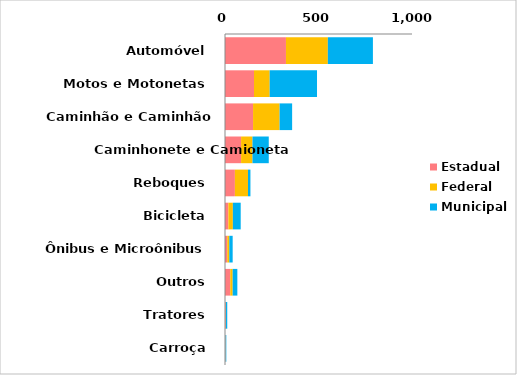
| Category | Estadual | Federal | Municipal |
|---|---|---|---|
| Automóvel | 326 | 224 | 241 |
| Motos e Motonetas | 155 | 84 | 253 |
| Caminhão e Caminhão Trator | 150 | 142 | 67 |
| Caminhonete e Camioneta | 86 | 61 | 87 |
| Reboques | 53 | 70 | 13 |
| Bicicleta | 18 | 24 | 42 |
| Ônibus e Microônibus | 12 | 11 | 18 |
| Outros | 28 | 13 | 25 |
| Tratores | 4 | 1 | 7 |
| Carroça | 2 | 1 | 4 |